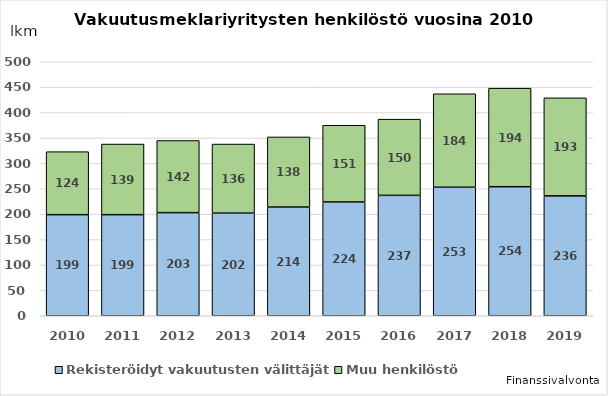
| Category | Rekisteröidyt vakuutusten välittäjät  | Muu henkilöstö |
|---|---|---|
| 2010.0 | 199 | 124 |
| 2011.0 | 199 | 139 |
| 2012.0 | 203 | 142 |
| 2013.0 | 202 | 136 |
| 2014.0 | 214 | 138 |
| 2015.0 | 224 | 151 |
| 2016.0 | 237 | 150 |
| 2017.0 | 253 | 184 |
| 2018.0 | 254 | 194 |
| 2019.0 | 236 | 193 |